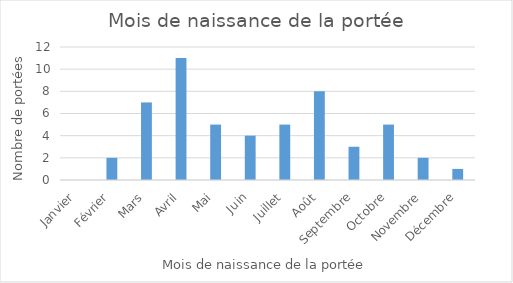
| Category | Series 0 |
|---|---|
| Janvier | 0 |
| Février | 2 |
| Mars | 7 |
| Avril | 11 |
| Mai | 5 |
| Juin | 4 |
| Juillet | 5 |
| Août | 8 |
| Septembre | 3 |
| Octobre | 5 |
| Novembre | 2 |
| Décembre | 1 |